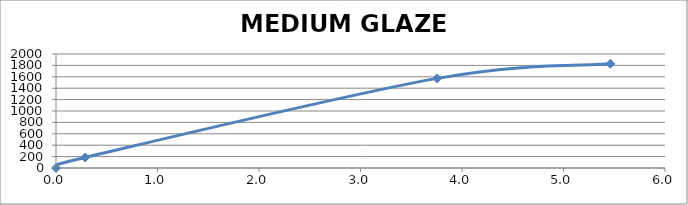
| Category | MEDIUM GLAZE CHART |
|---|---|
| 0.0 | 0 |
| 0.2875 | 185 |
| 3.755 | 1572 |
| 5.461666666666666 | 1828 |